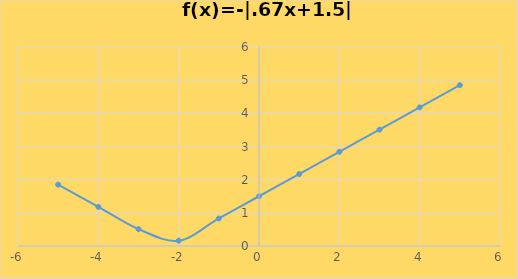
| Category | Series 0 |
|---|---|
| -5.0 | 1.85 |
| -4.0 | 1.18 |
| -3.0 | 0.51 |
| -2.0 | 0.16 |
| -1.0 | 0.83 |
| 0.0 | 1.5 |
| 1.0 | 2.17 |
| 2.0 | 2.84 |
| 3.0 | 3.51 |
| 4.0 | 4.18 |
| 5.0 | 4.85 |